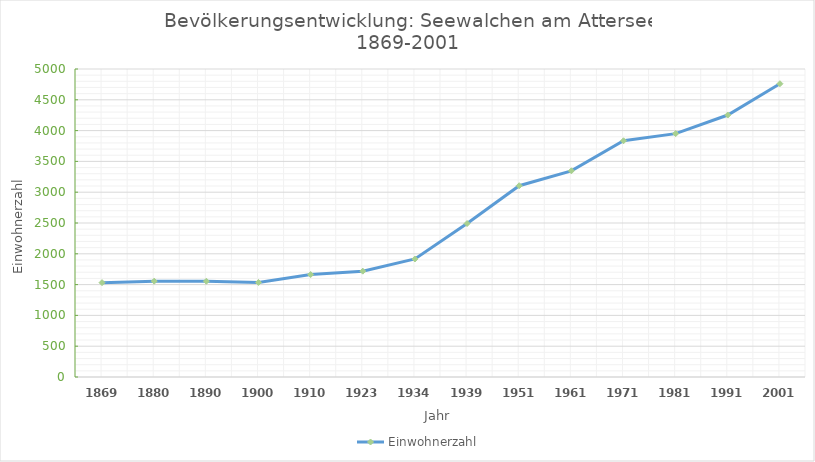
| Category | Einwohnerzahl |
|---|---|
| 1869.0 | 1532 |
| 1880.0 | 1556 |
| 1890.0 | 1555 |
| 1900.0 | 1535 |
| 1910.0 | 1663 |
| 1923.0 | 1718 |
| 1934.0 | 1916 |
| 1939.0 | 2491 |
| 1951.0 | 3105 |
| 1961.0 | 3347 |
| 1971.0 | 3835 |
| 1981.0 | 3951 |
| 1991.0 | 4253 |
| 2001.0 | 4761 |